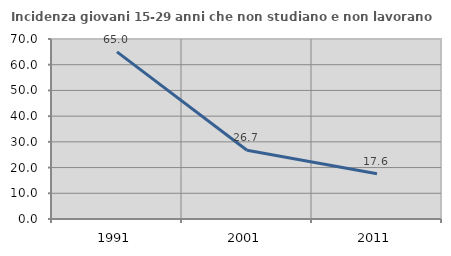
| Category | Incidenza giovani 15-29 anni che non studiano e non lavorano  |
|---|---|
| 1991.0 | 65 |
| 2001.0 | 26.709 |
| 2011.0 | 17.564 |